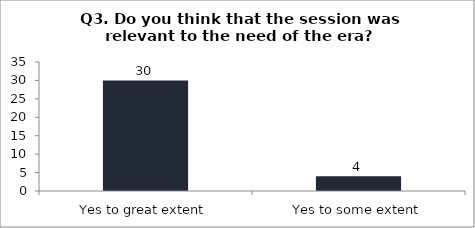
| Category | Q3. Do you think that the session was relevant to the need of the era? |
|---|---|
| Yes to great extent | 30 |
| Yes to some extent | 4 |